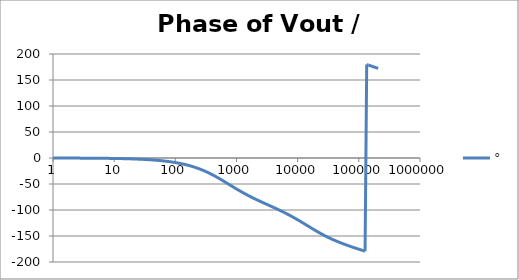
| Category | ° |
|---|---|
| 1.0 | -0.088 |
| 1.0634378492473788 | -0.094 |
| 1.1309000592118907 | -0.1 |
| 1.2026419266820265 | -0.106 |
| 1.278934943925458 | -0.113 |
| 1.3600678260954062 | -0.12 |
| 1.4463476038134566 | -0.127 |
| 1.5381007850634825 | -0.136 |
| 1.6356745907936145 | -0.144 |
| 1.739438268902148 | -0.153 |
| 1.849784491579884 | -0.163 |
| 1.967130841296868 | -0.173 |
| 2.091921391056928 | -0.184 |
| 2.2246283849001642 | -0.196 |
| 2.365754025012901 | -0.208 |
| 2.5158323722080485 | -0.222 |
| 2.6754313669678584 | -0.236 |
| 2.8451549786972743 | -0.251 |
| 3.025645491321301 | -0.267 |
| 3.2175859338757533 | -0.284 |
| 3.42170266528945 | -0.302 |
| 3.6387681231394358 | -0.321 |
| 3.8696037467813236 | -0.341 |
| 4.115083085916729 | -0.363 |
| 4.376135106361553 | -0.386 |
| 4.653747705525078 | -0.41 |
| 4.948971450903514 | -0.436 |
| 5.262923555735513 | -0.464 |
| 5.596792106864742 | -0.493 |
| 5.951840560808945 | -0.525 |
| 6.329412525049976 | -0.558 |
| 6.730936842638569 | -0.593 |
| 7.157932999355504 | -0.631 |
| 7.612016873891456 | -0.671 |
| 8.094906852805886 | -0.713 |
| 8.608430333405762 | -0.759 |
| 9.154530639152917 | -0.807 |
| 9.735274373770007 | -0.858 |
| 10.352859241875105 | -0.912 |
| 11.009622365740512 | -0.97 |
| 11.708049129648925 | -1.032 |
| 12.4507825853165 | -1.097 |
| 13.240633453975693 | -1.167 |
| 14.080590762968805 | -1.241 |
| 14.973833157104059 | -1.319 |
| 15.923740927579823 | -1.403 |
| 16.93390880399795 | -1.492 |
| 18.008159557874837 | -1.587 |
| 19.150558469130036 | -1.687 |
| 20.365428710297824 | -1.794 |
| 21.65736770667993 | -1.908 |
| 23.031264534351347 | -2.029 |
| 24.492318421858034 | -2.158 |
| 26.046058425622668 | -2.294 |
| 27.698364353515743 | -2.44 |
| 29.45548901577305 | -2.594 |
| 31.32408188746347 | -2.759 |
| 33.311214272052936 | -2.933 |
| 35.42440606129053 | -3.119 |
| 37.67165419268462 | -3.317 |
| 40.06146291225952 | -3.527 |
| 42.60287595711691 | -3.75 |
| 45.30551077958928 | -3.987 |
| 48.17959494250036 | -4.239 |
| 51.23600482326248 | -4.507 |
| 54.486306773278585 | -4.792 |
| 57.94280088840825 | -5.095 |
| 61.61856755613799 | -5.416 |
| 65.52751695560372 | -5.758 |
| 69.68444169778837 | -6.121 |
| 74.10507280510043 | -6.506 |
| 78.80613924217637 | -6.915 |
| 83.8054312231895 | -7.35 |
| 89.12186753523771 | -7.811 |
| 94.77556713258299 | -8.301 |
| 100.78792527267464 | -8.821 |
| 107.18169448207877 | -9.372 |
| 113.98107065871142 | -9.956 |
| 121.21178463621371 | -10.576 |
| 128.90119955697148 | -11.232 |
| 137.07841442227294 | -11.927 |
| 145.77437421146283 | -12.663 |
| 155.02198698682062 | -13.441 |
| 164.85624842731968 | -14.264 |
| 175.3143742625403 | -15.134 |
| 186.43594110790573 | -16.051 |
| 198.26303623420247 | -17.019 |
| 210.84041683815525 | -18.039 |
| 224.21567941678887 | -19.113 |
| 238.43943988652958 | -20.241 |
| 253.56552512868072 | -21.426 |
| 269.65117668612646 | -22.668 |
| 286.75726738211927 | -23.967 |
| 304.9485316808965 | -25.325 |
| 324.2938106618788 | -26.741 |
| 344.8663125345048 | -28.214 |
| 366.7438896795682 | -29.744 |
| 390.00933326545766 | -31.328 |
| 414.7506865542229 | -32.965 |
| 441.06157808309626 | -34.651 |
| 469.0415759823428 | -36.384 |
| 498.7965647702637 | -38.159 |
| 530.4391460512702 | -39.972 |
| 564.089064633379 | -41.818 |
| 599.8736616776864 | -43.691 |
| 637.9283565946681 | -45.585 |
| 678.3971595109495 | -47.495 |
| 721.4332162458546 | -49.414 |
| 767.1993878601115 | -51.337 |
| 815.868866969862 | -53.257 |
| 867.6258331583267 | -55.169 |
| 922.6661499653554 | -57.068 |
| 981.1981060925172 | -58.949 |
| 1043.443203628628 | -60.808 |
| 1109.6369962786232 | -62.64 |
| 1180.0299807678607 | -64.444 |
| 1254.8885447951977 | -66.218 |
| 1334.4959751221782 | -67.958 |
| 1419.1535296132129 | -69.666 |
| 1509.1815772837017 | -71.34 |
| 1604.9208106703452 | -72.98 |
| 1706.7335351116335 | -74.588 |
| 1815.0050398174897 | -76.165 |
| 1930.1450559166665 | -77.713 |
| 2052.58930699948 | -79.234 |
| 2182.801158023697 | -80.729 |
| 2321.2733688234066 | -82.203 |
| 2468.5299588567814 | -83.658 |
| 2625.128190249376 | -85.098 |
| 2791.6606766374607 | -86.525 |
| 2968.757625791824 | -87.943 |
| 3157.08922450881 | -89.355 |
| 3357.3681747937244 | -90.767 |
| 3570.352390934236 | -92.18 |
| 3796.8478676703417 | -93.598 |
| 4037.7117303148448 | -95.025 |
| 4293.8554783669315 | -96.465 |
| 4566.248434893605 | -97.921 |
| 4855.9214147324665 | -99.396 |
| 5163.970625397384 | -100.893 |
| 5491.561815449236 | -102.414 |
| 5839.934686030357 | -103.963 |
| 6210.40758225729 | -105.54 |
| 6604.382482225307 | -107.149 |
| 7023.350302504747 | -108.79 |
| 7468.896540206577 | -110.464 |
| 7942.707272968458 | -112.171 |
| 8446.575539567106 | -113.911 |
| 8982.408125302747 | -115.683 |
| 9552.232777834151 | -117.485 |
| 10158.205880770249 | -119.315 |
| 10802.620614058389 | -121.17 |
| 11487.915632049675 | -123.047 |
| 12216.684292082227 | -124.941 |
| 12991.684468506162 | -126.848 |
| 13815.848989288772 | -128.763 |
| 14692.296734695852 | -130.68 |
| 15624.344440049217 | -132.594 |
| 16615.519247226184 | -134.499 |
| 17669.572052398642 | -136.39 |
| 18790.49170052441 | -138.261 |
| 19982.5200803064 | -140.107 |
| 21250.168176743602 | -141.923 |
| 22598.233142021272 | -143.706 |
| 24031.816449341983 | -145.451 |
| 25556.34319839602 | -147.156 |
| 27177.582645530147 | -148.818 |
| 28901.67003630542 | -150.437 |
| 30735.129823066054 | -152.01 |
| 32684.900355380338 | -153.539 |
| 34758.3601367905 | -155.023 |
| 36963.35574723439 | -156.463 |
| 39308.23153680468 | -157.86 |
| 41801.861203217486 | -159.217 |
| 44453.68137248706 | -160.534 |
| 47273.727309885995 | -161.815 |
| 50272.670896332245 | -163.062 |
| 53461.86101391677 | -164.276 |
| 56853.36649340195 | -165.461 |
| 60460.02178621637 | -166.619 |
| 64295.47553378361 | -167.753 |
| 68374.24221798431 | -168.864 |
| 72711.75708821259 | -169.956 |
| 77324.43457288652 | -171.03 |
| 82229.73039646025 | -172.089 |
| 87446.2076370035 | -173.134 |
| 92993.60697433475 | -174.169 |
| 98892.92139454243 | -175.195 |
| 105166.47563360249 | -176.215 |
| 111838.01066072512 | -177.23 |
| 118932.77352114675 | -178.244 |
| 126477.61287835392 | -179.259 |
| 134501.0806172993 | 179.723 |
| 143033.53989310883 | 178.7 |
| 152107.28003416685 | 177.668 |
| 161756.63873440344 | 176.626 |
| 172018.1319971993 | 175.57 |
| 182930.592322653 | 174.497 |
| 194535.31566115122 | 173.406 |
| 206876.217689355 | 172.293 |